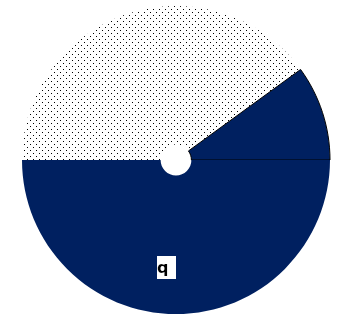
| Category | Series 1 |
|---|---|
|  | 0.15 |
|  | 0.1 |
| q | 0.5 |